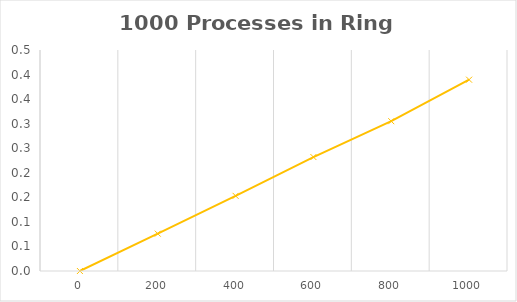
| Category | 1000 |
|---|---|
| 0.0 | 0 |
| 200.0 | 0.076 |
| 400.0 | 0.153 |
| 600.0 | 0.232 |
| 800.0 | 0.305 |
| 1000.0 | 0.39 |